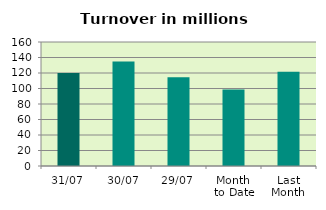
| Category | Series 0 |
|---|---|
| 31/07 | 120.142 |
| 30/07 | 134.773 |
| 29/07 | 114.497 |
| Month 
to Date | 98.668 |
| Last
Month | 121.74 |